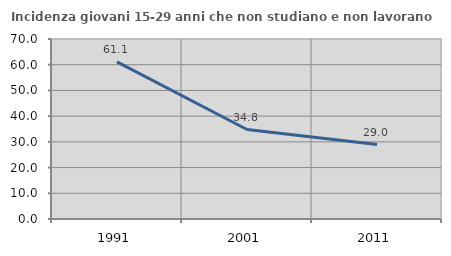
| Category | Incidenza giovani 15-29 anni che non studiano e non lavorano  |
|---|---|
| 1991.0 | 61.129 |
| 2001.0 | 34.795 |
| 2011.0 | 28.961 |